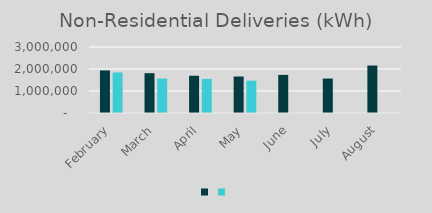
| Category | Series 1 | Series 0 |
|---|---|---|
| February | 1935461 | 1843770 |
| March | 1810164 | 1565360 |
| April | 1693101 | 1549578 |
| May | 1658799 | 1468467 |
| June | 1732026 | 0 |
| July | 1565715 | 0 |
| August | 2157982 | 0 |